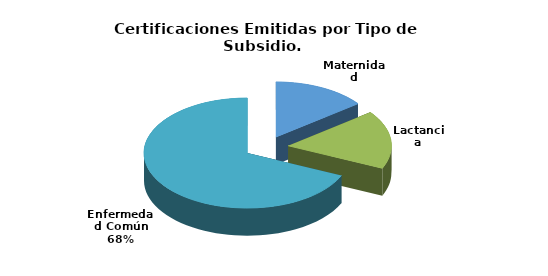
| Category | Total |
|---|---|
| Maternidad | 6 |
| Lactancia | 7 |
| Enfermedad Común | 28 |